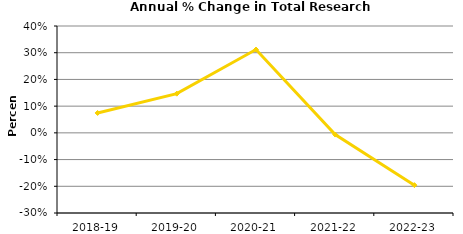
| Category | Series 0 |
|---|---|
| 2018-19 | 0.075 |
| 2019-20 | 0.147 |
| 2020-21 | 0.312 |
| 2021-22 | -0.006 |
| 2022-23 | -0.196 |